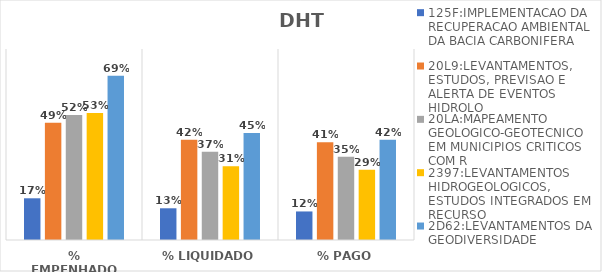
| Category | 125F:IMPLEMENTACAO DA RECUPERACAO AMBIENTAL DA BACIA CARBONIFERA | 20L9:LEVANTAMENTOS, ESTUDOS, PREVISAO E ALERTA DE EVENTOS HIDROLO | 20LA:MAPEAMENTO GEOLOGICO-GEOTECNICO EM MUNICIPIOS CRITICOS COM R | 2397:LEVANTAMENTOS HIDROGEOLOGICOS, ESTUDOS INTEGRADOS EM RECURSO | 2D62:LEVANTAMENTOS DA GEODIVERSIDADE |
|---|---|---|---|---|---|
| % EMPENHADO | 0.175 | 0.491 | 0.523 | 0.532 | 0.688 |
| % LIQUIDADO | 0.133 | 0.42 | 0.37 | 0.309 | 0.448 |
| % PAGO | 0.12 | 0.41 | 0.349 | 0.294 | 0.42 |